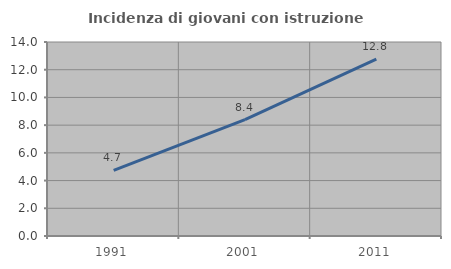
| Category | Incidenza di giovani con istruzione universitaria |
|---|---|
| 1991.0 | 4.73 |
| 2001.0 | 8.4 |
| 2011.0 | 12.772 |